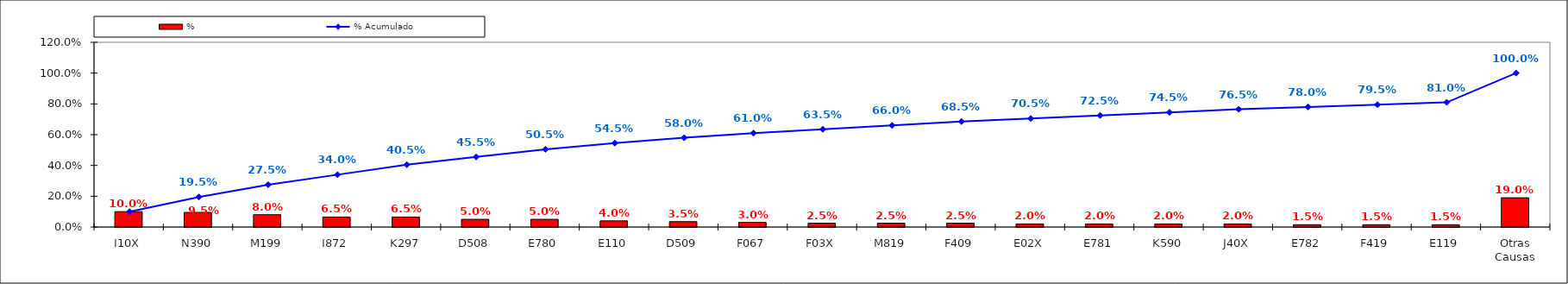
| Category | % |
|---|---|
| I10X | 0.1 |
| N390 | 0.095 |
| M199 | 0.08 |
| I872 | 0.065 |
| K297 | 0.065 |
| D508 | 0.05 |
| E780 | 0.05 |
| E110 | 0.04 |
| D509 | 0.035 |
| F067 | 0.03 |
| F03X | 0.025 |
| M819 | 0.025 |
| F409 | 0.025 |
| E02X | 0.02 |
| E781 | 0.02 |
| K590 | 0.02 |
| J40X | 0.02 |
| E782 | 0.015 |
| F419 | 0.015 |
| E119 | 0.015 |
| Otras Causas | 0.19 |